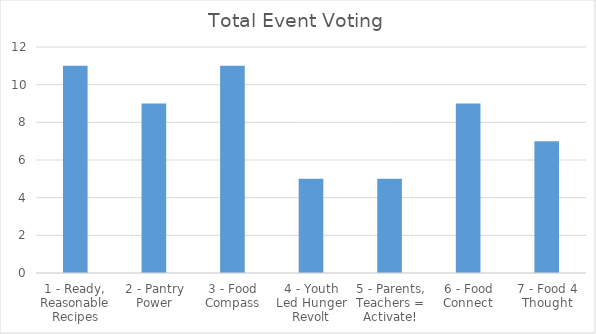
| Category | Total Event Voting |
|---|---|
| 1 - Ready, Reasonable Recipes | 11 |
| 2 - Pantry Power | 9 |
| 3 - Food Compass | 11 |
| 4 - Youth Led Hunger Revolt | 5 |
| 5 - Parents, Teachers = Activate! | 5 |
| 6 - Food Connect | 9 |
| 7 - Food 4 Thought | 7 |